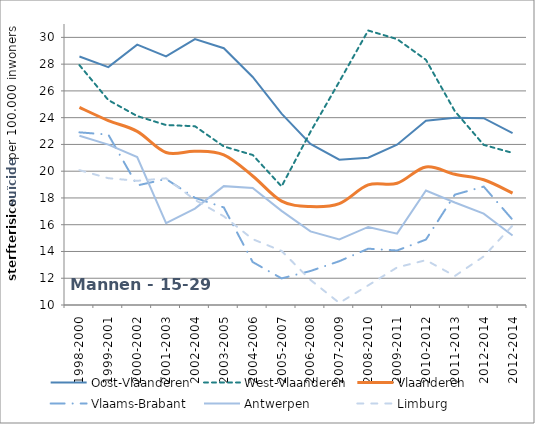
| Category | Oost-Vlaanderen | West-Vlaanderen | Vlaanderen | Vlaams-Brabant | Antwerpen | Limburg |
|---|---|---|---|---|---|---|
| 1998-2000 | 28.571 | 27.926 | 24.768 | 22.902 | 22.647 | 20.078 |
| 1999-2001 | 27.78 | 25.316 | 23.783 | 22.734 | 21.987 | 19.476 |
| 2000-2002 | 29.461 | 24.12 | 22.973 | 18.933 | 21.053 | 19.282 |
| 2001-2003 | 28.58 | 23.45 | 21.394 | 19.415 | 16.123 | 19.469 |
| 2002-2004 | 29.875 | 23.36 | 21.495 | 18.01 | 17.202 | 17.858 |
| 2003-2005 | 29.189 | 21.848 | 21.216 | 17.289 | 18.883 | 16.63 |
| 2004-2006 | 27.043 | 21.213 | 19.642 | 13.212 | 18.75 | 14.921 |
| 2005-2007 | 24.295 | 18.862 | 17.766 | 11.988 | 17.032 | 14.041 |
| 2006-2008 | 22.04 | 22.936 | 17.359 | 12.54 | 15.501 | 11.875 |
| 2007-2009 | 20.862 | 26.692 | 17.581 | 13.274 | 14.903 | 10.154 |
| 2008-2010 | 21.006 | 30.514 | 18.975 | 14.208 | 15.832 | 11.467 |
| 2009-2011 | 21.979 | 29.873 | 19.096 | 14.072 | 15.331 | 12.807 |
| 2010-2012 | 23.768 | 28.323 | 20.313 | 14.888 | 18.558 | 13.353 |
| 2011-2013 | 24.001 | 24.488 | 19.767 | 18.246 | 17.661 | 12.167 |
| 2012-2014 | 23.964 | 21.967 | 19.361 | 18.85 | 16.825 | 13.629 |
| 2012-2014 | 22.852 | 21.367 | 18.365 | 16.371 | 15.197 | 15.942 |